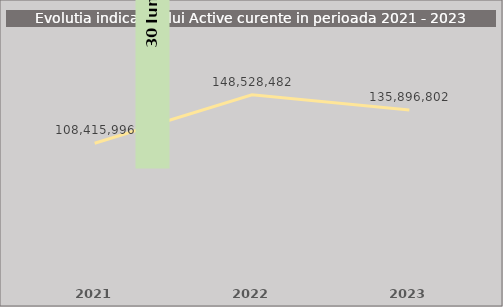
| Category | Series 0 |
|---|---|
| 2021.0 | 108415996.085 |
| 2022.0 | 148528481.681 |
| 2023.0 | 135896802.133 |